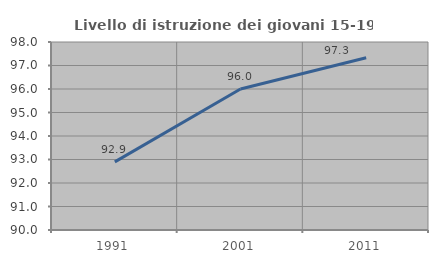
| Category | Livello di istruzione dei giovani 15-19 anni |
|---|---|
| 1991.0 | 92.898 |
| 2001.0 | 96 |
| 2011.0 | 97.328 |